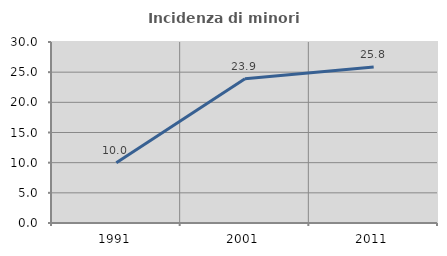
| Category | Incidenza di minori stranieri |
|---|---|
| 1991.0 | 10 |
| 2001.0 | 23.896 |
| 2011.0 | 25.848 |